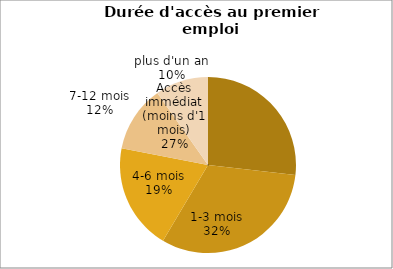
| Category | Promotion 2007 |
|---|---|
| Accès immédiat (moins d'1 mois) | 0.268 |
| 1-3 mois | 0.317 |
| 4-6 mois | 0.195 |
| 7-12 mois | 0.122 |
| plus d'un an | 0.098 |